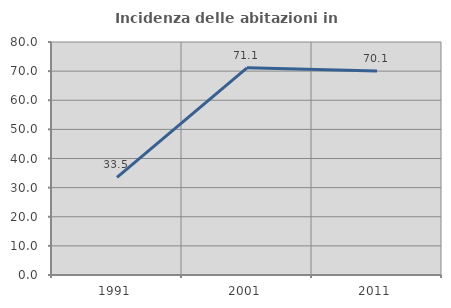
| Category | Incidenza delle abitazioni in proprietà  |
|---|---|
| 1991.0 | 33.509 |
| 2001.0 | 71.13 |
| 2011.0 | 70.076 |